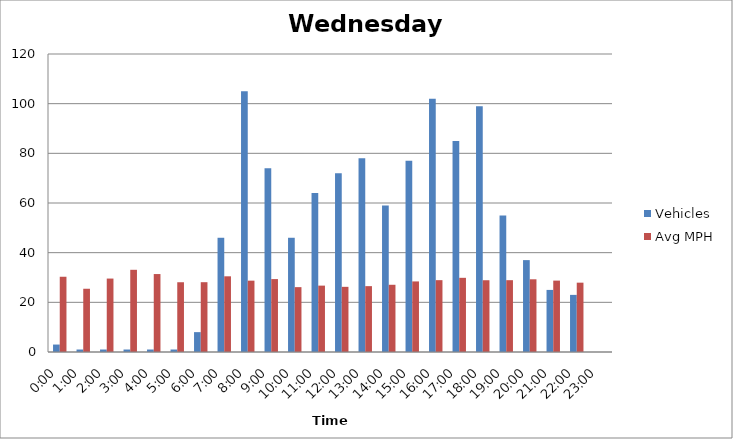
| Category | Vehicles | Avg MPH |
|---|---|---|
| 0:00 | 3 | 30.3 |
| 1:00 | 1 | 25.47 |
| 2:00 | 1 | 29.57 |
| 3:00 | 1 | 33.1 |
| 4:00 | 1 | 31.39 |
| 5:00 | 1 | 28.09 |
| 6:00 | 8 | 28.11 |
| 7:00 | 46 | 30.48 |
| 8:00 | 105 | 28.73 |
| 9:00 | 74 | 29.36 |
| 10:00 | 46 | 26.12 |
| 11:00 | 64 | 26.73 |
| 12:00 | 72 | 26.24 |
| 13:00 | 78 | 26.52 |
| 14:00 | 59 | 27.07 |
| 15:00 | 77 | 28.42 |
| 16:00 | 102 | 28.93 |
| 17:00 | 85 | 29.87 |
| 18:00 | 99 | 28.9 |
| 19:00 | 55 | 28.92 |
| 20:00 | 37 | 29.28 |
| 21:00 | 25 | 28.75 |
| 22:00 | 23 | 27.92 |
| 23:00 | 0 | 0 |